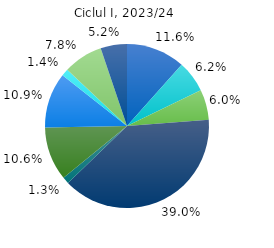
| Category | 2023/24 |
|---|---|
| 0 | 11.6 |
| 1 | 6.2 |
| 2 | 6 |
| 3 | 39 |
| 4 | 1.3 |
| 5 | 10.6 |
| 6 | 10.9 |
| 7 | 1.4 |
| 8 | 7.8 |
| 9 | 5.2 |